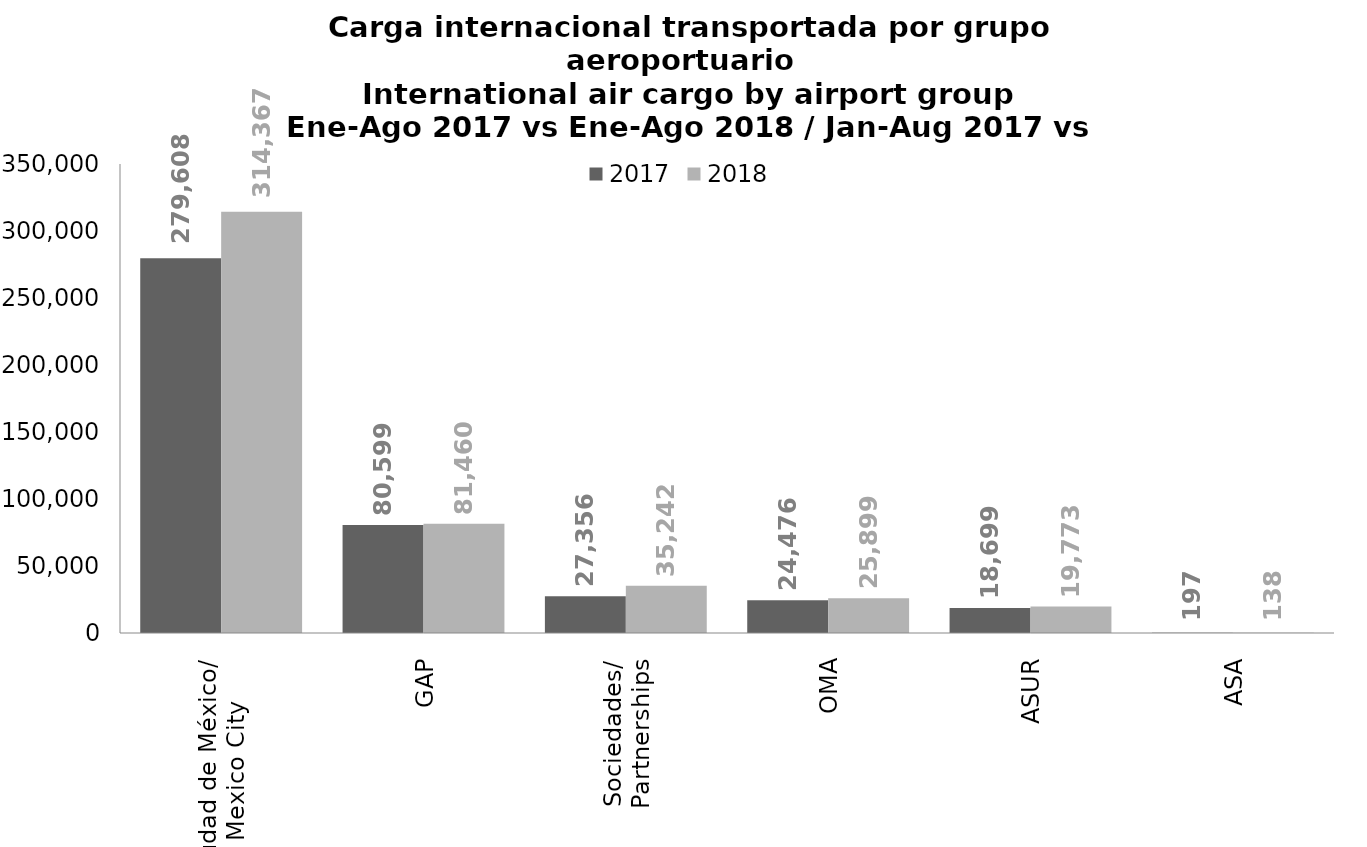
| Category | 2017 | 2018 |
|---|---|---|
| Ciudad de México/
Mexico City | 279608.27 | 314367.12 |
| GAP | 80599.076 | 81460.179 |
| Sociedades/
Partnerships | 27356.103 | 35242.235 |
| OMA | 24476.397 | 25898.746 |
| ASUR | 18698.725 | 19773.216 |
| ASA | 196.609 | 137.597 |